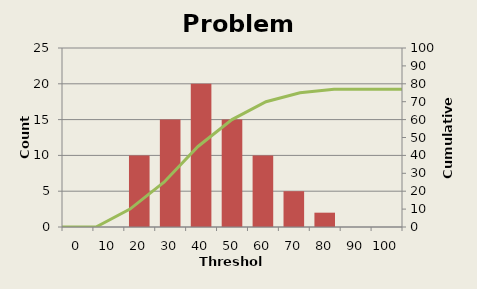
| Category | Count |
|---|---|
| 0.0 | 0 |
| 10.0 | 0 |
| 20.0 | 10 |
| 30.0 | 15 |
| 40.0 | 20 |
| 50.0 | 15 |
| 60.0 | 10 |
| 70.0 | 5 |
| 80.0 | 2 |
| 90.0 | 0 |
| 100.0 | 0 |